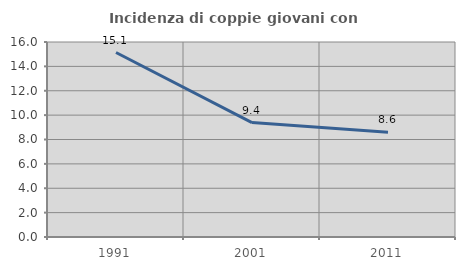
| Category | Incidenza di coppie giovani con figli |
|---|---|
| 1991.0 | 15.138 |
| 2001.0 | 9.39 |
| 2011.0 | 8.59 |